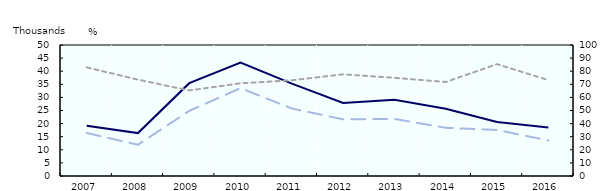
| Category | Total discouraged workers, thousands (left scale) | LT discouraged workers, thousands (left scale) |
|---|---|---|
| 2007.0 | 19.198 | 16.414 |
| 2008.0 | 16.386 | 11.929 |
| 2009.0 | 35.422 | 24.869 |
| 2010.0 | 43.332 | 33.528 |
| 2011.0 | 35.232 | 25.746 |
| 2012.0 | 27.872 | 21.63 |
| 2013.0 | 29.086 | 21.794 |
| 2014.0 | 25.631 | 18.395 |
| 2015.0 | 20.578 | 17.571 |
| 2016.0 | 18.537 | 13.57 |